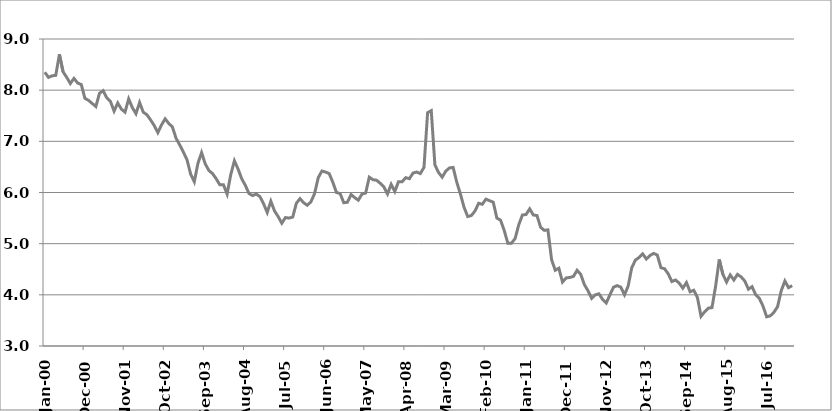
| Category | Series 1 |
|---|---|
| 2000-01-01 | 8.35 |
| 2000-02-01 | 8.25 |
| 2000-03-01 | 8.28 |
| 2000-04-01 | 8.29 |
| 2000-05-01 | 8.7 |
| 2000-06-01 | 8.36 |
| 2000-07-01 | 8.25 |
| 2000-08-01 | 8.13 |
| 2000-09-01 | 8.23 |
| 2000-10-01 | 8.14 |
| 2000-11-01 | 8.11 |
| 2000-12-01 | 7.84 |
| 2001-01-01 | 7.8 |
| 2001-02-01 | 7.74 |
| 2001-03-01 | 7.68 |
| 2001-04-01 | 7.94 |
| 2001-05-01 | 7.99 |
| 2001-06-01 | 7.85 |
| 2001-07-01 | 7.78 |
| 2001-08-01 | 7.59 |
| 2001-09-01 | 7.75 |
| 2001-10-01 | 7.63 |
| 2001-11-01 | 7.57 |
| 2001-12-01 | 7.83 |
| 2002-01-01 | 7.66 |
| 2002-02-01 | 7.54 |
| 2002-03-01 | 7.76 |
| 2002-04-01 | 7.57 |
| 2002-05-01 | 7.52 |
| 2002-06-01 | 7.42 |
| 2002-07-01 | 7.31 |
| 2002-08-01 | 7.17 |
| 2002-09-01 | 7.32 |
| 2002-10-01 | 7.44 |
| 2002-11-01 | 7.35 |
| 2002-12-01 | 7.28 |
| 2003-01-01 | 7.06 |
| 2003-02-01 | 6.93 |
| 2003-03-01 | 6.79 |
| 2003-04-01 | 6.64 |
| 2003-05-01 | 6.36 |
| 2003-06-01 | 6.21 |
| 2003-07-01 | 6.57 |
| 2003-08-01 | 6.78 |
| 2003-09-01 | 6.56 |
| 2003-10-01 | 6.43 |
| 2003-11-01 | 6.37 |
| 2003-12-01 | 6.27 |
| 2004-01-01 | 6.15 |
| 2004-02-01 | 6.15 |
| 2004-03-01 | 5.97 |
| 2004-04-01 | 6.35 |
| 2004-05-01 | 6.62 |
| 2004-06-01 | 6.46 |
| 2004-07-01 | 6.27 |
| 2004-08-01 | 6.14 |
| 2004-09-01 | 5.98 |
| 2004-10-01 | 5.94 |
| 2004-11-01 | 5.97 |
| 2004-12-01 | 5.92 |
| 2005-01-01 | 5.78 |
| 2005-02-01 | 5.61 |
| 2005-03-01 | 5.83 |
| 2005-04-01 | 5.64 |
| 2005-05-01 | 5.53 |
| 2005-06-01 | 5.4 |
| 2005-07-01 | 5.51 |
| 2005-08-01 | 5.5 |
| 2005-09-01 | 5.52 |
| 2005-10-01 | 5.79 |
| 2005-11-01 | 5.88 |
| 2005-12-01 | 5.8 |
| 2006-01-01 | 5.75 |
| 2006-02-01 | 5.82 |
| 2006-03-01 | 5.98 |
| 2006-04-01 | 6.29 |
| 2006-05-01 | 6.42 |
| 2006-06-01 | 6.4 |
| 2006-07-01 | 6.37 |
| 2006-08-01 | 6.2 |
| 2006-09-01 | 6 |
| 2006-10-01 | 5.98 |
| 2006-11-01 | 5.8 |
| 2006-12-01 | 5.81 |
| 2007-01-01 | 5.96 |
| 2007-02-01 | 5.9 |
| 2007-03-01 | 5.85 |
| 2007-04-01 | 5.97 |
| 2007-05-01 | 5.99 |
| 2007-06-01 | 6.3 |
| 2007-07-01 | 6.25 |
| 2007-08-01 | 6.24 |
| 2007-09-01 | 6.18 |
| 2007-10-01 | 6.11 |
| 2007-11-01 | 5.97 |
| 2007-12-01 | 6.16 |
| 2008-01-01 | 6.02 |
| 2008-02-01 | 6.21 |
| 2008-03-01 | 6.21 |
| 2008-04-01 | 6.29 |
| 2008-05-01 | 6.27 |
| 2008-06-01 | 6.38 |
| 2008-07-01 | 6.4 |
| 2008-08-01 | 6.37 |
| 2008-09-01 | 6.49 |
| 2008-10-01 | 7.56 |
| 2008-11-01 | 7.6 |
| 2008-12-01 | 6.54 |
| 2009-01-01 | 6.39 |
| 2009-02-01 | 6.3 |
| 2009-03-01 | 6.42 |
| 2009-04-01 | 6.48 |
| 2009-05-01 | 6.49 |
| 2009-06-01 | 6.2 |
| 2009-07-01 | 5.97 |
| 2009-08-01 | 5.71 |
| 2009-09-01 | 5.53 |
| 2009-10-01 | 5.55 |
| 2009-11-01 | 5.64 |
| 2009-12-01 | 5.79 |
| 2010-01-01 | 5.77 |
| 2010-02-01 | 5.87 |
| 2010-03-01 | 5.84 |
| 2010-04-01 | 5.81 |
| 2010-05-01 | 5.5 |
| 2010-06-01 | 5.46 |
| 2010-07-01 | 5.26 |
| 2010-08-01 | 5.01 |
| 2010-09-01 | 5.01 |
| 2010-10-01 | 5.1 |
| 2010-11-01 | 5.37 |
| 2010-12-01 | 5.56 |
| 2011-01-01 | 5.57 |
| 2011-02-01 | 5.68 |
| 2011-03-01 | 5.56 |
| 2011-04-01 | 5.55 |
| 2011-05-01 | 5.32 |
| 2011-06-01 | 5.26 |
| 2011-07-01 | 5.27 |
| 2011-08-01 | 4.69 |
| 2011-09-01 | 4.48 |
| 2011-10-01 | 4.52 |
| 2011-11-01 | 4.25 |
| 2011-12-01 | 4.33 |
| 2012-01-01 | 4.34 |
| 2012-02-01 | 4.36 |
| 2012-03-01 | 4.48 |
| 2012-04-01 | 4.4 |
| 2012-05-01 | 4.2 |
| 2012-06-01 | 4.08 |
| 2012-07-01 | 3.93 |
| 2012-08-01 | 4 |
| 2012-09-01 | 4.02 |
| 2012-10-01 | 3.91 |
| 2012-11-01 | 3.84 |
| 2012-12-01 | 4 |
| 2013-01-01 | 4.15 |
| 2013-02-01 | 4.18 |
| 2013-03-01 | 4.15 |
| 2013-04-01 | 4 |
| 2013-05-01 | 4.17 |
| 2013-06-01 | 4.53 |
| 2013-07-01 | 4.68 |
| 2013-08-01 | 4.73 |
| 2013-09-01 | 4.8 |
| 2013-10-01 | 4.7 |
| 2013-11-01 | 4.77 |
| 2013-12-01 | 4.81 |
| 2014-01-01 | 4.778 |
| 2014-02-01 | 4.53 |
| 2014-03-01 | 4.51 |
| 2014-04-01 | 4.41 |
| 2014-05-01 | 4.26 |
| 2014-06-01 | 4.29 |
| 2014-07-01 | 4.23 |
| 2014-08-01 | 4.13 |
| 2014-09-01 | 4.24 |
| 2014-10-01 | 4.06 |
| 2014-11-01 | 4.09 |
| 2014-12-01 | 3.95 |
| 2015-01-01 | 3.58 |
| 2015-02-01 | 3.67 |
| 2015-03-01 | 3.74 |
| 2015-04-01 | 3.75 |
| 2015-05-01 | 4.17 |
| 2015-06-01 | 4.69 |
| 2015-07-01 | 4.4 |
| 2015-08-01 | 4.25 |
| 2015-09-01 | 4.39 |
| 2015-10-01 | 4.29 |
| 2015-11-01 | 4.4 |
| 2015-12-01 | 4.35 |
| 2016-01-01 | 4.27 |
| 2016-02-01 | 4.11 |
| 2016-03-01 | 4.16 |
| 2016-04-01 | 4 |
| 2016-05-01 | 3.93 |
| 2016-06-01 | 3.78 |
| 2016-07-01 | 3.57 |
| 2016-08-01 | 3.59 |
| 2016-09-01 | 3.66 |
| 2016-10-01 | 3.77 |
| 2016-11-01 | 4.08 |
| 2016-12-01 | 4.27 |
| 2017-01-01 | 4.14 |
| 2017-02-01 | 4.18 |